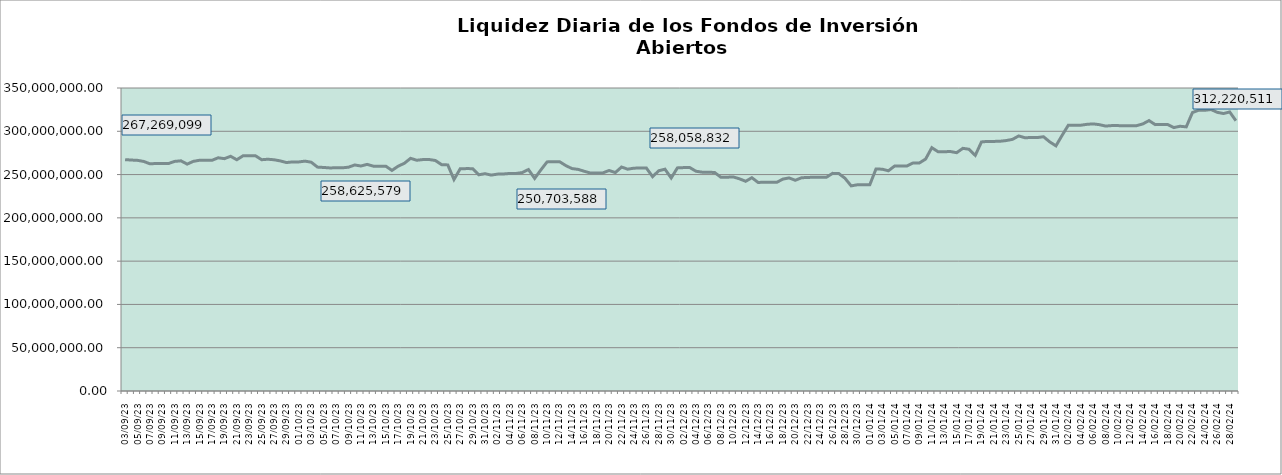
| Category | Series 0 |
|---|---|
| 2023-09-03 | 267269098.808 |
| 2023-09-04 | 266779912.404 |
| 2023-09-05 | 266423412.259 |
| 2023-09-06 | 265184608.264 |
| 2023-09-07 | 262410317.356 |
| 2023-09-08 | 262806869.644 |
| 2023-09-09 | 262821074.002 |
| 2023-09-10 | 262787028.385 |
| 2023-09-11 | 265239241.987 |
| 2023-09-12 | 265878366.655 |
| 2023-09-13 | 262082547.549 |
| 2023-09-14 | 265274524.884 |
| 2023-09-15 | 266530060.162 |
| 2023-09-16 | 266498074.095 |
| 2023-09-17 | 266464177.407 |
| 2023-09-18 | 269407544.635 |
| 2023-09-19 | 268386012.834 |
| 2023-09-20 | 271110404.809 |
| 2023-09-21 | 267143636.946 |
| 2023-09-22 | 271642099.325 |
| 2023-09-23 | 271740882.303 |
| 2023-09-24 | 271762655.585 |
| 2023-09-25 | 267162818.648 |
| 2023-09-26 | 267715039.802 |
| 2023-09-27 | 267113824.803 |
| 2023-09-28 | 265791769.238 |
| 2023-09-29 | 263892185.898 |
| 2023-09-30 | 264635497.115 |
| 2023-10-01 | 264600897.465 |
| 2023-10-02 | 265529015.845 |
| 2023-10-03 | 264253465.645 |
| 2023-10-04 | 258625578.634 |
| 2023-10-05 | 258204777.048 |
| 2023-10-06 | 257676377.08 |
| 2023-10-07 | 257832001.667 |
| 2023-10-08 | 257796729.715 |
| 2023-10-09 | 258529193.105 |
| 2023-10-10 | 261073637.771 |
| 2023-10-11 | 259886083.35 |
| 2023-10-12 | 261775193.355 |
| 2023-10-13 | 259717402.01 |
| 2023-10-14 | 259676145.41 |
| 2023-10-15 | 259747512.644 |
| 2023-10-16 | 254809952.944 |
| 2023-10-17 | 259666499.164 |
| 2023-10-18 | 263044571.881 |
| 2023-10-19 | 268768029.653 |
| 2023-10-20 | 266544404.028 |
| 2023-10-21 | 267342218.165 |
| 2023-10-22 | 267387659.242 |
| 2023-10-23 | 266256506.511 |
| 2023-10-24 | 261477808.451 |
| 2023-10-25 | 261136324.379 |
| 2023-10-26 | 244289582.148 |
| 2023-10-27 | 256725726.913 |
| 2023-10-28 | 256882714.939 |
| 2023-10-29 | 256848393.546 |
| 2023-10-30 | 249762390.647 |
| 2023-10-31 | 251018915.669 |
| 2023-11-01 | 249390236.924 |
| 2023-11-02 | 250513974.509 |
| 2023-11-03 | 250703587.81 |
| 2023-11-04 | 251305745.953 |
| 2023-11-05 | 251310162.073 |
| 2023-11-06 | 252308063.504 |
| 2023-11-07 | 255837832.856 |
| 2023-11-08 | 245567140.883 |
| 2023-11-09 | 255413885.319 |
| 2023-11-10 | 264654548.422 |
| 2023-11-11 | 264830247.978 |
| 2023-11-12 | 264936018.497 |
| 2023-11-13 | 260462293.767 |
| 2023-11-14 | 256955732.766 |
| 2023-11-15 | 255993653.226 |
| 2023-11-16 | 253801689.772 |
| 2023-11-17 | 251731925.926 |
| 2023-11-18 | 251789720.62 |
| 2023-11-19 | 251954733.551 |
| 2023-11-20 | 254737752.679 |
| 2023-11-21 | 252315414.844 |
| 2023-11-22 | 258721388.36 |
| 2023-11-23 | 256193263.75 |
| 2023-11-24 | 257434010.328 |
| 2023-11-25 | 257472188.921 |
| 2023-11-26 | 257562306.801 |
| 2023-11-27 | 247607679.202 |
| 2023-11-28 | 254440086.604 |
| 2023-11-29 | 256213922.424 |
| 2023-11-30 | 246006765.78 |
| 2023-12-01 | 257730811.163 |
| 2023-12-02 | 258058831.658 |
| 2023-12-03 | 258071642.36 |
| 2023-12-04 | 253844576.837 |
| 2023-12-05 | 252748068.447 |
| 2023-12-06 | 252731517.214 |
| 2023-12-07 | 252399645.609 |
| 2023-12-08 | 246923466.127 |
| 2023-12-09 | 246948922.828 |
| 2023-12-10 | 247276938.684 |
| 2023-12-11 | 245115345.321 |
| 2023-12-12 | 242223952.142 |
| 2023-12-13 | 246380170.514 |
| 2023-12-14 | 240942095.986 |
| 2023-12-15 | 241060256.906 |
| 2023-12-16 | 240987808.771 |
| 2023-12-17 | 240985918.907 |
| 2023-12-18 | 244785928.431 |
| 2023-12-19 | 246129981.549 |
| 2023-12-20 | 243396357.252 |
| 2023-12-21 | 246304201.887 |
| 2023-12-22 | 246713513.798 |
| 2023-12-23 | 246841111.366 |
| 2023-12-24 | 246806910.561 |
| 2023-12-25 | 246807879.962 |
| 2023-12-26 | 251393577.72 |
| 2023-12-27 | 251222372.259 |
| 2023-12-28 | 245768806.796 |
| 2023-12-29 | 236961205.739 |
| 2023-12-30 | 238173852.337 |
| 2023-12-31 | 238168894.448 |
| 2024-01-01 | 238159318.355 |
| 2024-01-02 | 256417132.614 |
| 2024-01-03 | 256237272.834 |
| 2024-01-04 | 254378978.275 |
| 2024-01-05 | 259859063.839 |
| 2024-01-06 | 260003606.886 |
| 2024-01-07 | 259992287.424 |
| 2024-01-08 | 263490421.235 |
| 2024-01-09 | 263432827.772 |
| 2024-01-10 | 267929544.952 |
| 2024-01-11 | 281076106.864 |
| 2024-01-12 | 276394492.903 |
| 2024-01-13 | 276419176.207 |
| 2024-01-14 | 276601693.299 |
| 2024-01-15 | 275276424.188 |
| 2024-01-16 | 280321195.065 |
| 2024-01-17 | 279243993.664 |
| 2024-01-18 | 272163771.518 |
| 2024-01-19 | 287699369.763 |
| 2024-01-20 | 288338655.233 |
| 2024-01-21 | 288305441.545 |
| 2024-01-22 | 288479521.894 |
| 2024-01-23 | 289309934.863 |
| 2024-01-24 | 290672111.704 |
| 2024-01-25 | 294643641.674 |
| 2024-01-26 | 292541994.869 |
| 2024-01-27 | 292812100.409 |
| 2024-01-28 | 292776319.203 |
| 2024-01-29 | 293689912.788 |
| 2024-01-30 | 287776845.625 |
| 2024-01-31 | 283164991.225 |
| 2024-02-01 | 295345475.11 |
| 2024-02-02 | 307090698.277 |
| 2024-02-03 | 307067043.255 |
| 2024-02-04 | 307030752.223 |
| 2024-02-05 | 308047961.012 |
| 2024-02-06 | 308547088.273 |
| 2024-02-07 | 307651321.15 |
| 2024-02-08 | 306041334.592 |
| 2024-02-09 | 306581293.17 |
| 2024-02-10 | 306538999.787 |
| 2024-02-11 | 306500991.024 |
| 2024-02-12 | 306476146.62 |
| 2024-02-13 | 306484796.678 |
| 2024-02-14 | 308512743.118 |
| 2024-02-15 | 312354077.867 |
| 2024-02-16 | 307692124.734 |
| 2024-02-17 | 307830962.709 |
| 2024-02-18 | 307792893.874 |
| 2024-02-19 | 304282015.067 |
| 2024-02-20 | 305808774.284 |
| 2024-02-21 | 305089528.892 |
| 2024-02-22 | 321672887.027 |
| 2024-02-23 | 324342286.481 |
| 2024-02-24 | 324279905.788 |
| 2024-02-25 | 325112100.635 |
| 2024-02-26 | 321884004.525 |
| 2024-02-27 | 320484978.723 |
| 2024-02-28 | 322320050.148 |
| 2024-02-29 | 312220511.266 |